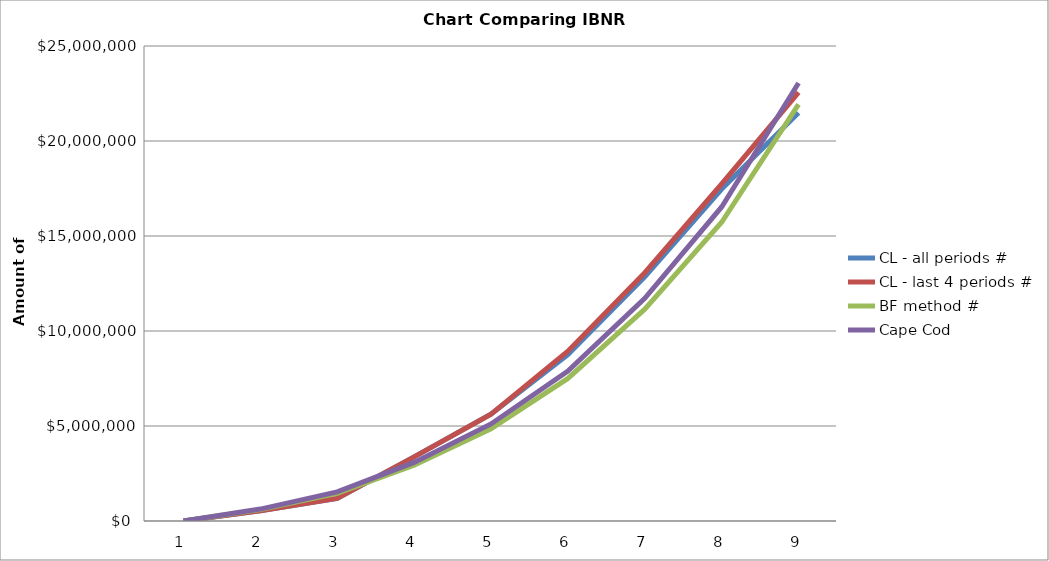
| Category | CL - all periods # | CL - last 4 periods # | BF method # | Cape Cod |
|---|---|---|---|---|
| 0 | 0 | 0 | 0 | 0 |
| 1 | 542292.82 | 542292.82 | 597155.578 | 627735.102 |
| 2 | 1189029.468 | 1189029.468 | 1460183.868 | 1534957.898 |
| 3 | 3374624.077 | 3374624.077 | 2935398.5 | 3085716.264 |
| 4 | 5623330.467 | 5623330.467 | 4858410.11 | 5107202.682 |
| 5 | 8759857.563 | 8939122.215 | 7504236.032 | 7888517.749 |
| 6 | 12847249.039 | 13068265.651 | 11148368.885 | 11719261.688 |
| 7 | 17471812.717 | 17737174.201 | 15723358.869 | 16528530.685 |
| 8 | 21481857.367 | 22559751.621 | 21927242.093 | 23050106.328 |